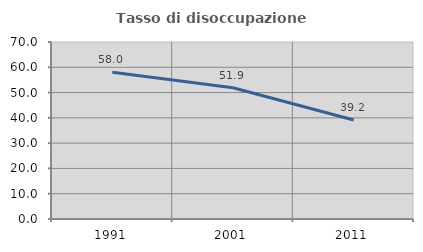
| Category | Tasso di disoccupazione giovanile  |
|---|---|
| 1991.0 | 58.028 |
| 2001.0 | 51.899 |
| 2011.0 | 39.157 |